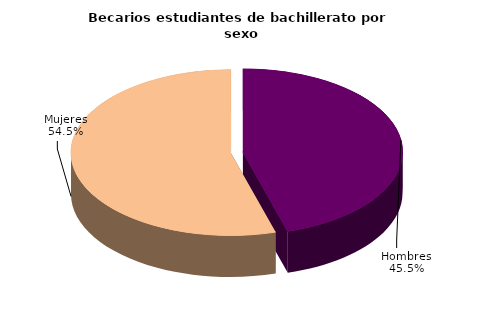
| Category | Series 0 |
|---|---|
| Hombres | 29285 |
| Mujeres | 35127 |